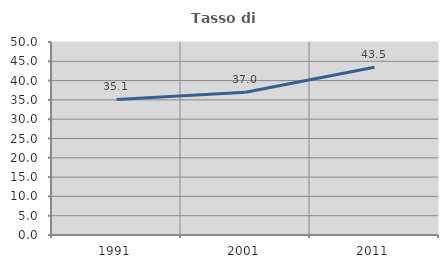
| Category | Tasso di occupazione   |
|---|---|
| 1991.0 | 35.127 |
| 2001.0 | 37.006 |
| 2011.0 | 43.467 |